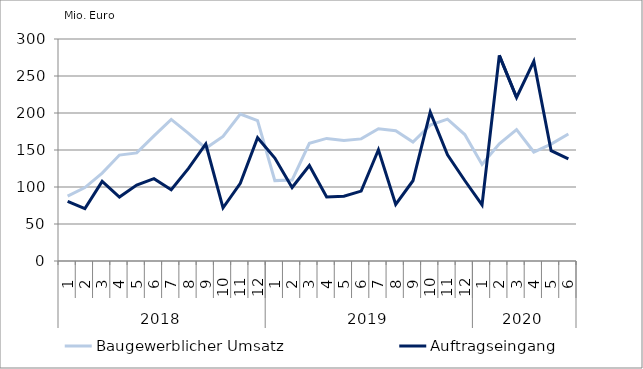
| Category | Baugewerblicher Umsatz | Auftragseingang |
|---|---|---|
| 0 | 87640.529 | 80684.627 |
| 1 | 99259.455 | 70746.763 |
| 2 | 118764.324 | 107538.747 |
| 3 | 143144.178 | 86374.619 |
| 4 | 146070.782 | 102661.329 |
| 5 | 169150.753 | 111287.709 |
| 6 | 191277.885 | 96286.662 |
| 7 | 172425.535 | 125142.495 |
| 8 | 152354.98 | 158112.302 |
| 9 | 168372.756 | 71808.619 |
| 10 | 198558.472 | 104904.147 |
| 11 | 189665.914 | 166653.461 |
| 12 | 108616.605 | 139065.287 |
| 13 | 109331.58 | 99318.609 |
| 14 | 159117.81 | 129002.041 |
| 15 | 165654.287 | 86579.2 |
| 16 | 162976.056 | 87644.362 |
| 17 | 165026.188 | 94463.186 |
| 18 | 178622.938 | 150345.08 |
| 19 | 176074.101 | 76434.317 |
| 20 | 160663.041 | 108444.162 |
| 21 | 183589.485 | 201122.697 |
| 22 | 191777.213 | 143514.792 |
| 23 | 170885.223 | 108780.022 |
| 24 | 130445.562 | 75891.481 |
| 25 | 158433.655 | 277923.85 |
| 26 | 177529.832 | 220973.626 |
| 27 | 147259.799 | 269936.091 |
| 28 | 157965.891 | 149072.895 |
| 29 | 171647.778 | 137984.76 |